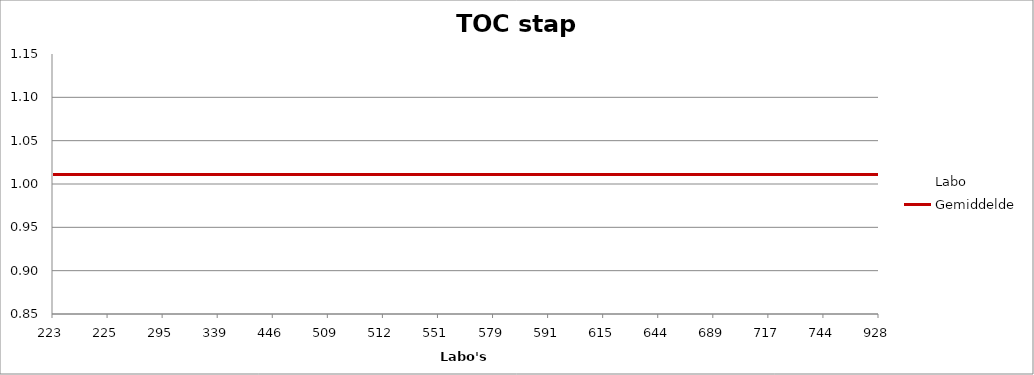
| Category | Labo | Gemiddelde |
|---|---|---|
| 223.0 | 1.001 | 1.011 |
| 225.0 | 1.032 | 1.011 |
| 295.0 | 0.992 | 1.011 |
| 339.0 | 1.035 | 1.011 |
| 446.0 | 1.023 | 1.011 |
| 509.0 | 1.025 | 1.011 |
| 512.0 | 1.017 | 1.011 |
| 551.0 | 1.032 | 1.011 |
| 579.0 | 0.994 | 1.011 |
| 591.0 | 1.004 | 1.011 |
| 615.0 | 0.91 | 1.011 |
| 644.0 | 1 | 1.011 |
| 689.0 | 0.986 | 1.011 |
| 717.0 | 1.007 | 1.011 |
| 744.0 | 1.005 | 1.011 |
| 928.0 | 1.058 | 1.011 |